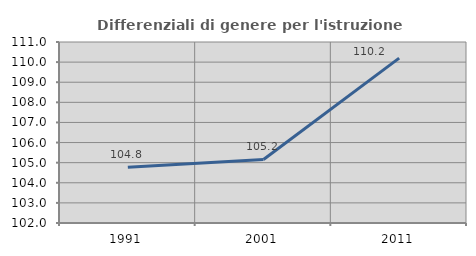
| Category | Differenziali di genere per l'istruzione superiore |
|---|---|
| 1991.0 | 104.774 |
| 2001.0 | 105.158 |
| 2011.0 | 110.2 |